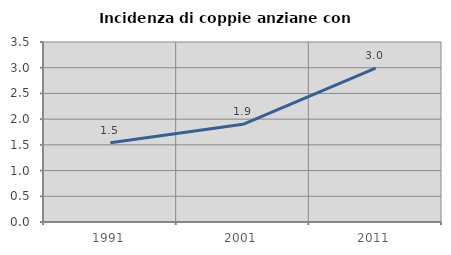
| Category | Incidenza di coppie anziane con figli |
|---|---|
| 1991.0 | 1.542 |
| 2001.0 | 1.9 |
| 2011.0 | 2.992 |